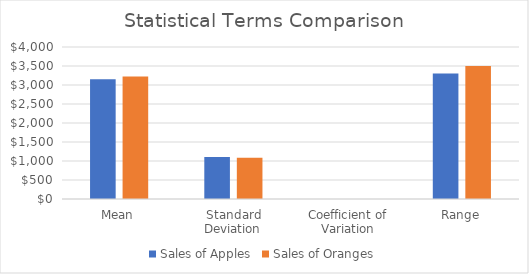
| Category | Sales of Apples | Sales of Oranges |
|---|---|---|
| Mean | 3150 | 3225 |
| Standard Deviation | 1105.829 | 1084.633 |
| Coefficient of Variation | 0.351 | 0.336 |
| Range | 3300 | 3500 |